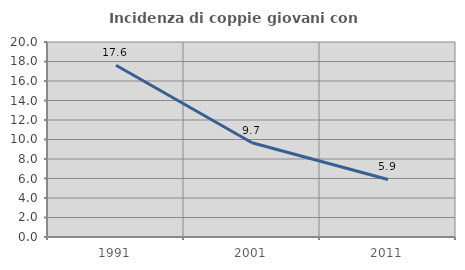
| Category | Incidenza di coppie giovani con figli |
|---|---|
| 1991.0 | 17.623 |
| 2001.0 | 9.666 |
| 2011.0 | 5.903 |